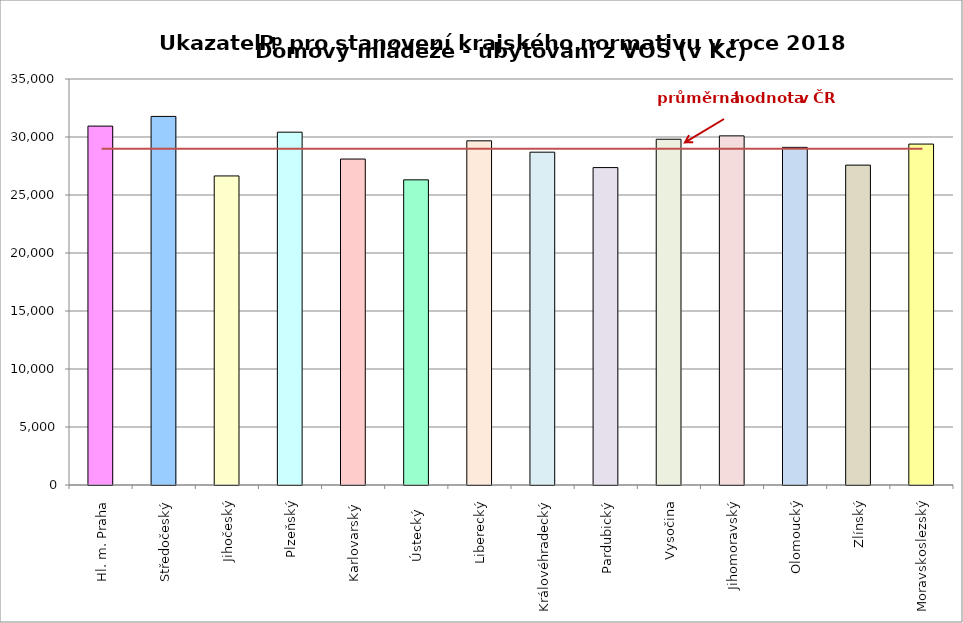
| Category | Series 0 |
|---|---|
| Hl. m. Praha | 30940 |
| Středočeský | 31774 |
| Jihočeský | 26642 |
| Plzeňský | 30415 |
| Karlovarský  | 28100 |
| Ústecký   | 26307 |
| Liberecký | 29670 |
| Královéhradecký | 28692 |
| Pardubický | 27363 |
| Vysočina | 29807 |
| Jihomoravský | 30098 |
| Olomoucký | 29106 |
| Zlínský | 27576 |
| Moravskoslezský | 29390 |